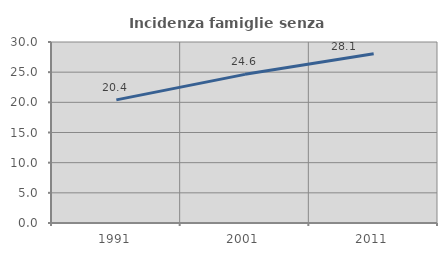
| Category | Incidenza famiglie senza nuclei |
|---|---|
| 1991.0 | 20.409 |
| 2001.0 | 24.638 |
| 2011.0 | 28.058 |